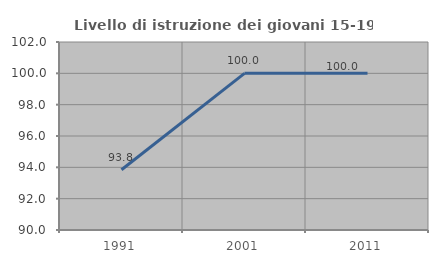
| Category | Livello di istruzione dei giovani 15-19 anni |
|---|---|
| 1991.0 | 93.846 |
| 2001.0 | 100 |
| 2011.0 | 100 |